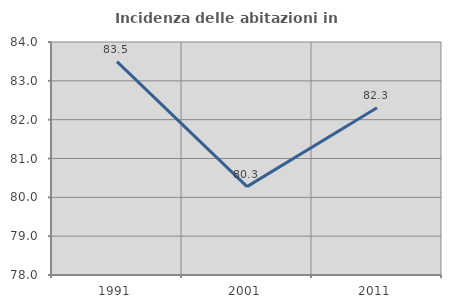
| Category | Incidenza delle abitazioni in proprietà  |
|---|---|
| 1991.0 | 83.495 |
| 2001.0 | 80.275 |
| 2011.0 | 82.308 |